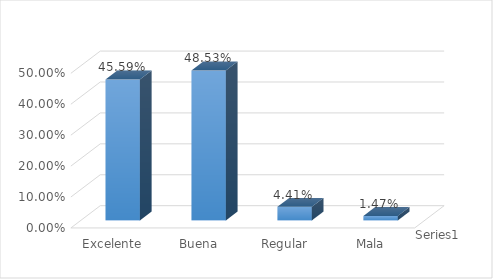
| Category | Series 0 |
|---|---|
| Excelente | 0.456 |
| Buena | 0.485 |
| Regular | 0.044 |
| Mala | 0.015 |